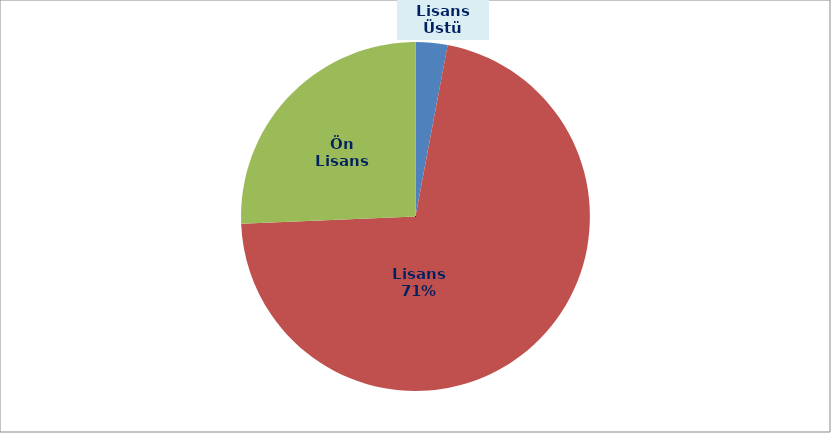
| Category | Sütun1 |
|---|---|
| Lisans Üstü | 253 |
| Lisans  | 6123 |
| Ön Lisans | 2200 |